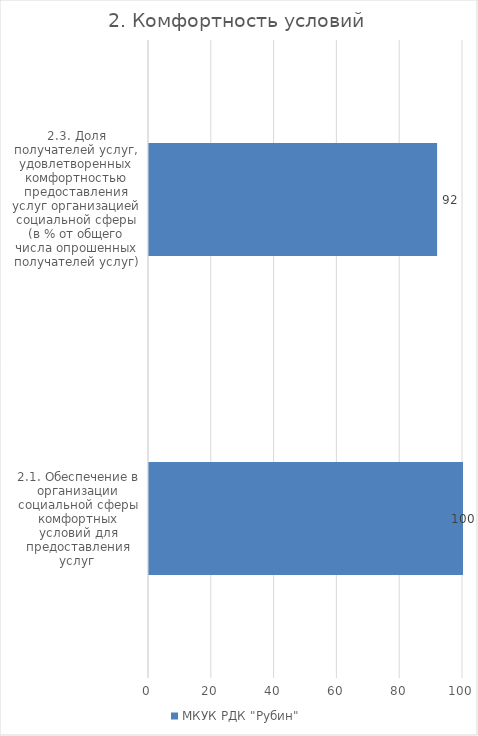
| Category | МКУК РДК "Рубин"  |
|---|---|
| 2.1. Обеспечение в организации социальной сферы комфортных условий для предоставления услуг  | 100 |
| 2.3. Доля получателей услуг, удовлетворенных комфортностью предоставления услуг организацией социальной сферы (в % от общего числа опрошенных получателей услуг) | 91.756 |